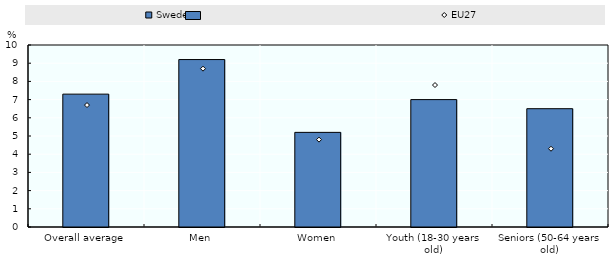
| Category | Sweden |
|---|---|
| Overall average | 7.3 |
| Men | 9.2 |
| Women | 5.2 |
| Youth (18-30 years old) | 7 |
| Seniors (50-64 years old) | 6.5 |